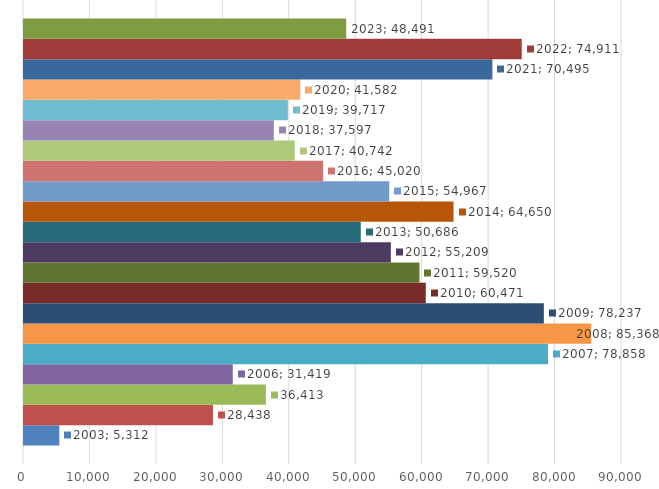
| Category | 2003 | 2004 | 2005 | 2006 | 2007 | 2008 | 2009 | 2010 | 2011 | 2012 | 2013 | 2014 | 2015 | 2016 | 2017 | 2018 | 2019 | 2020 | 2021 | 2022 | 2023 |
|---|---|---|---|---|---|---|---|---|---|---|---|---|---|---|---|---|---|---|---|---|---|
| 0 | 5312 | 28438 | 36413 | 31419 | 78858 | 85368 | 78237 | 60471 | 59520 | 55209 | 50686 | 64650 | 54967 | 45020 | 40742 | 37597 | 39717 | 41582 | 70495 | 74911 | 48491 |